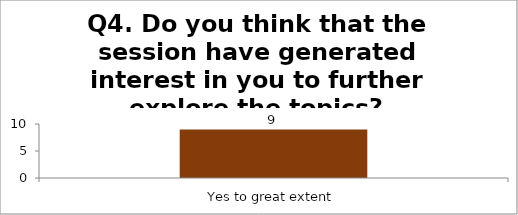
| Category | Q4. Do you think that the session have generated interest in you to further explore the topics? |
|---|---|
| Yes to great extent | 9 |